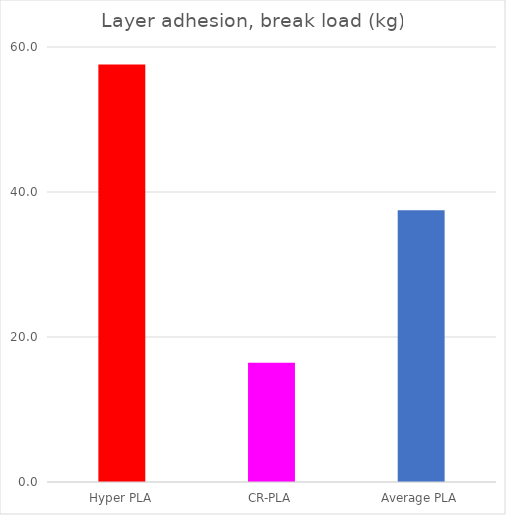
| Category | Average (kg) |
|---|---|
| Hyper PLA | 57.6 |
| CR-PLA | 16.45 |
| Average PLA | 37.5 |